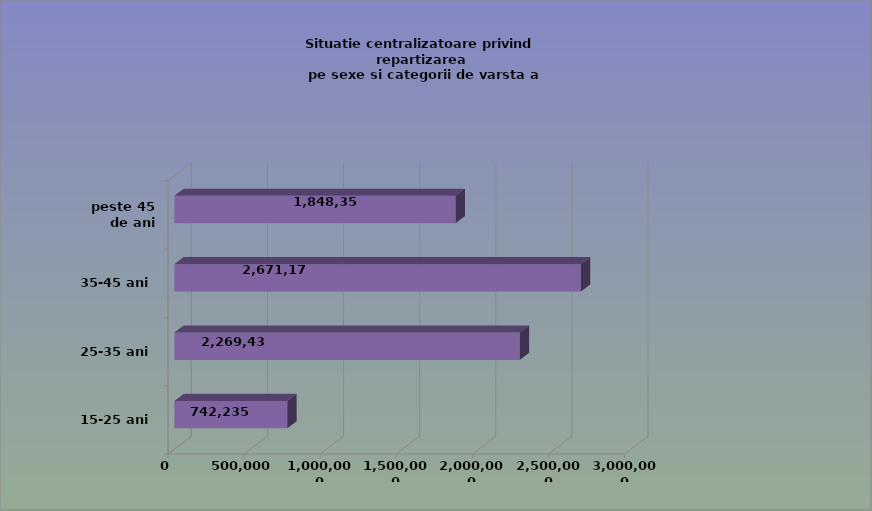
| Category | 15-25 ani 25-35 ani 35-45 ani peste 45 de ani |
|---|---|
| 15-25 ani | 742235 |
| 25-35 ani | 2269438 |
| 35-45 ani | 2671170 |
| peste 45 de ani | 1848358 |